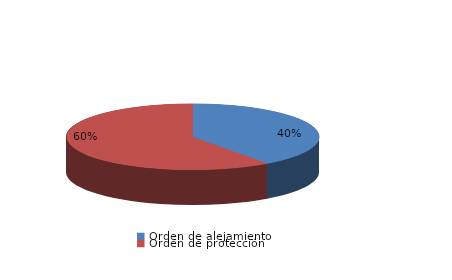
| Category | Series 0 |
|---|---|
| Orden de alejamiento | 4 |
| Orden de protección | 6 |